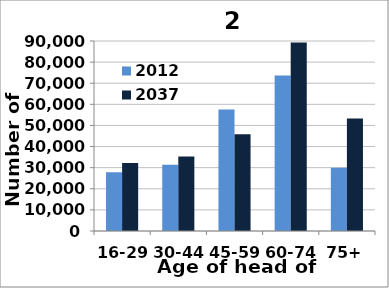
| Category | 2012 | 2037 |
|---|---|---|
| 16-29 | 27824 | 32196 |
| 30-44 | 31360 | 35265 |
| 45-59 | 57573 | 45793 |
| 60-74 | 73643 | 89264 |
| 75+ | 29936 | 53260 |